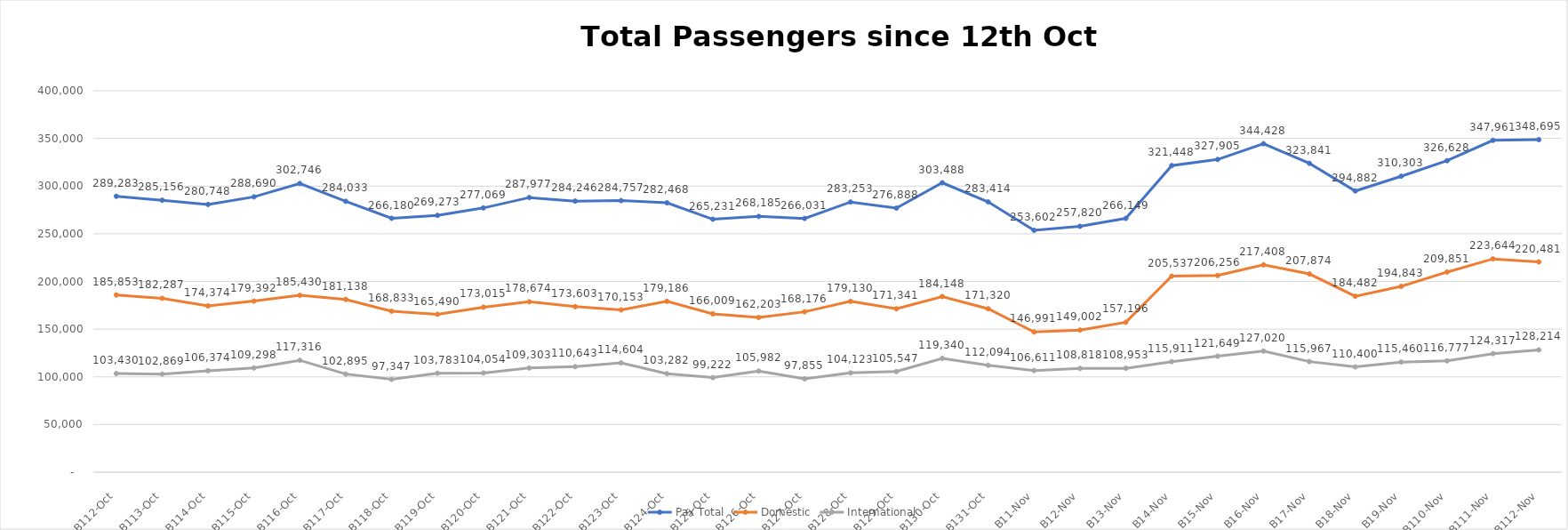
| Category | Pax Total |  Domestic  |  International  |
|---|---|---|---|
| 2022-10-12 | 289283 | 185853 | 103430 |
| 2022-10-13 | 285156 | 182287 | 102869 |
| 2022-10-14 | 280748 | 174374 | 106374 |
| 2022-10-15 | 288690 | 179392 | 109298 |
| 2022-10-16 | 302746 | 185430 | 117316 |
| 2022-10-17 | 284033 | 181138 | 102895 |
| 2022-10-18 | 266180 | 168833 | 97347 |
| 2022-10-19 | 269273 | 165490 | 103783 |
| 2022-10-20 | 277069 | 173015 | 104054 |
| 2022-10-21 | 287977 | 178674 | 109303 |
| 2022-10-22 | 284246 | 173603 | 110643 |
| 2022-10-23 | 284757 | 170153 | 114604 |
| 2022-10-24 | 282468 | 179186 | 103282 |
| 2022-10-25 | 265231 | 166009 | 99222 |
| 2022-10-26 | 268185 | 162203 | 105982 |
| 2022-10-27 | 266031 | 168176 | 97855 |
| 2022-10-28 | 283253 | 179130 | 104123 |
| 2022-10-29 | 276888 | 171341 | 105547 |
| 2022-10-30 | 303488 | 184148 | 119340 |
| 2022-10-31 | 283414 | 171320 | 112094 |
| 2022-11-01 | 253602 | 146991 | 106611 |
| 2022-11-02 | 257820 | 149002 | 108818 |
| 2022-11-03 | 266149 | 157196 | 108953 |
| 2022-11-04 | 321448 | 205537 | 115911 |
| 2022-11-05 | 327905 | 206256 | 121649 |
| 2022-11-06 | 344428 | 217408 | 127020 |
| 2022-11-07 | 323841 | 207874 | 115967 |
| 2022-11-08 | 294882 | 184482 | 110400 |
| 2022-11-09 | 310303 | 194843 | 115460 |
| 2022-11-10 | 326628 | 209851 | 116777 |
| 2022-11-11 | 347961 | 223644 | 124317 |
| 2022-11-12 | 348695 | 220481 | 128214 |